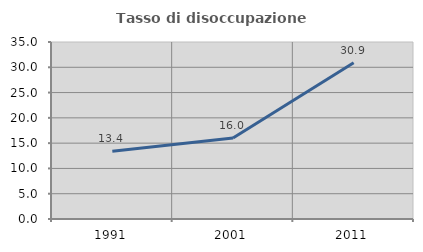
| Category | Tasso di disoccupazione giovanile  |
|---|---|
| 1991.0 | 13.402 |
| 2001.0 | 16 |
| 2011.0 | 30.909 |